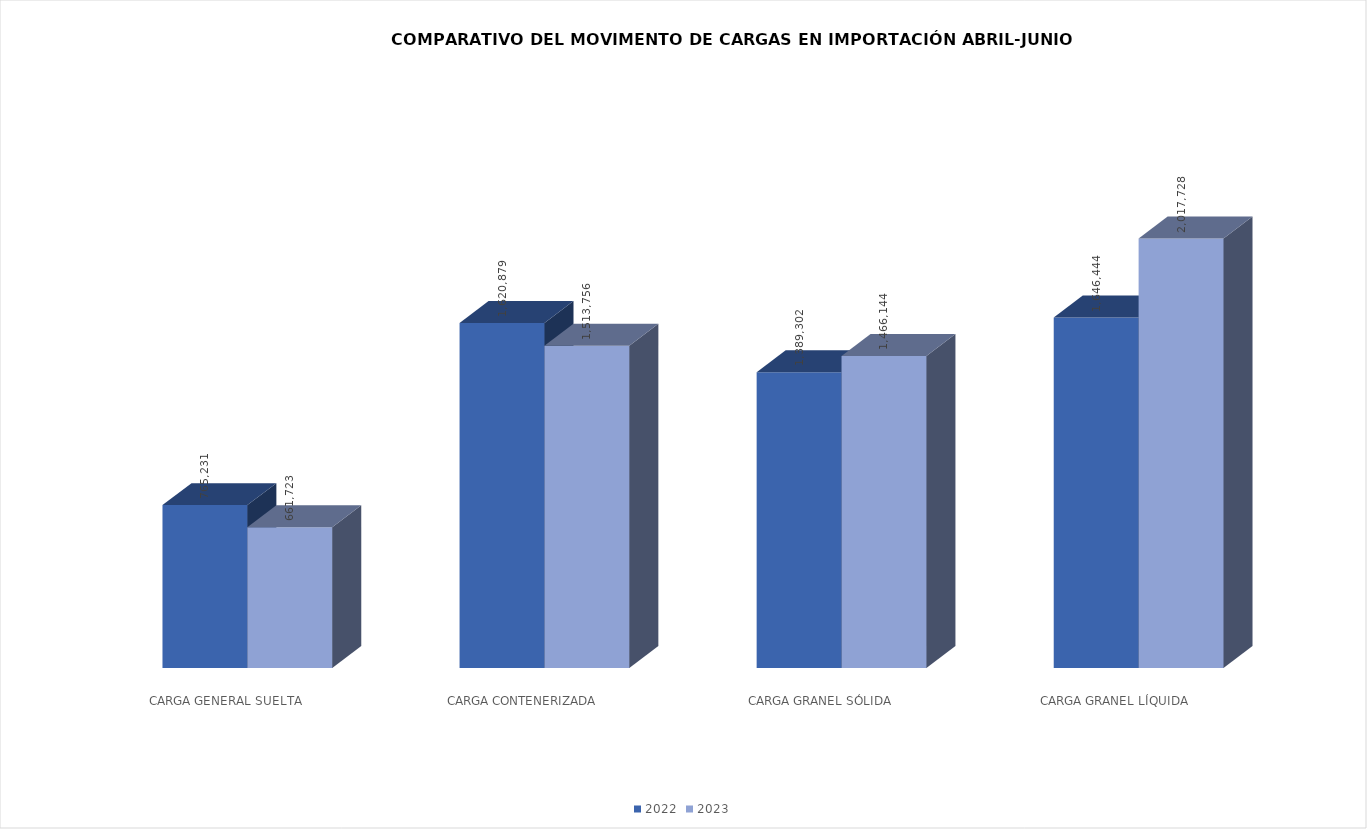
| Category | 2022 | 2023 |
|---|---|---|
|  CARGA GENERAL SUELTA | 765231.35 | 661723 |
|  CARGA CONTENERIZADA | 1620879 | 1513756 |
|  CARGA GRANEL SÓLIDA | 1389302 | 1466144 |
| CARGA GRANEL LÍQUIDA | 1646443.54 | 2017728 |